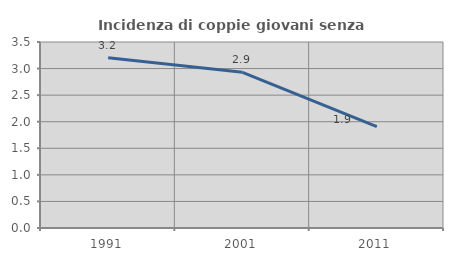
| Category | Incidenza di coppie giovani senza figli |
|---|---|
| 1991.0 | 3.203 |
| 2001.0 | 2.93 |
| 2011.0 | 1.908 |